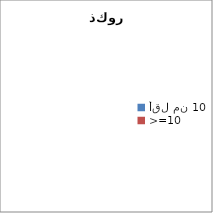
| Category | ذكور |
|---|---|
| أقل من 10 | 0 |
| >=10 | 0 |